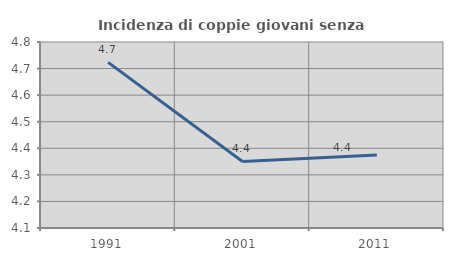
| Category | Incidenza di coppie giovani senza figli |
|---|---|
| 1991.0 | 4.723 |
| 2001.0 | 4.35 |
| 2011.0 | 4.375 |